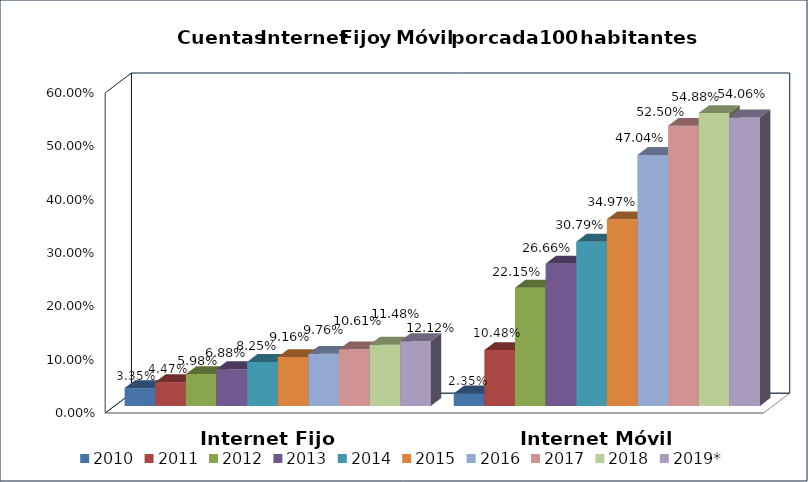
| Category | 2010 | 2011 | 2012 | 2013 | 2014 | 2015 | 2016 | 2017 | 2018 | 2019* |
|---|---|---|---|---|---|---|---|---|---|---|
| Internet Fijo | 0.033 | 0.045 | 0.06 | 0.069 | 0.083 | 0.092 | 0.098 | 0.106 | 0.115 | 0.121 |
| Internet Móvil | 0.024 | 0.105 | 0.222 | 0.267 | 0.308 | 0.35 | 0.47 | 0.525 | 0.549 | 0.541 |